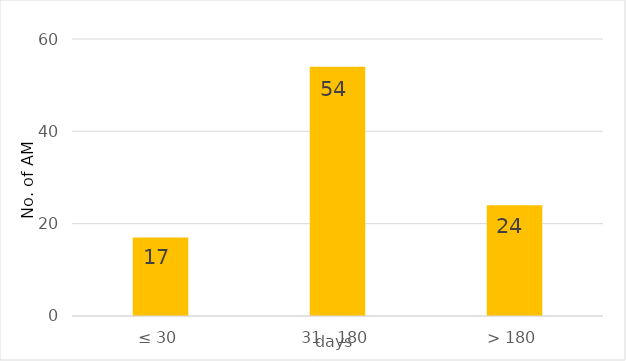
| Category | Series 0 |
|---|---|
| 0 | 17 |
| 1 | 54 |
| 2 | 24 |